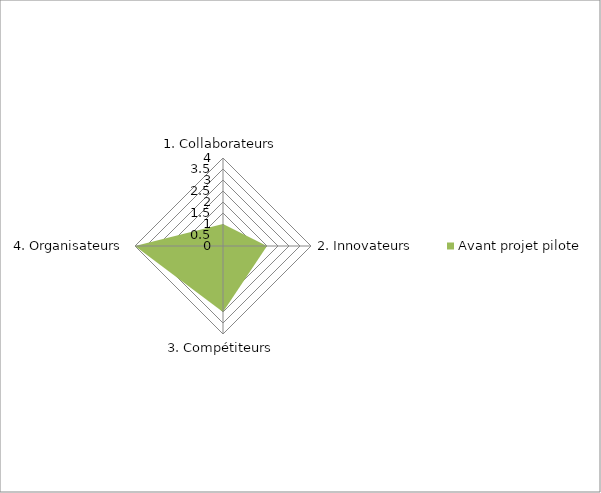
| Category | Avant projet pilote |
|---|---|
| 1. Collaborateurs | 1 |
| 2. Innovateurs | 2 |
| 3. Compétiteurs | 3 |
| 4. Organisateurs | 4 |